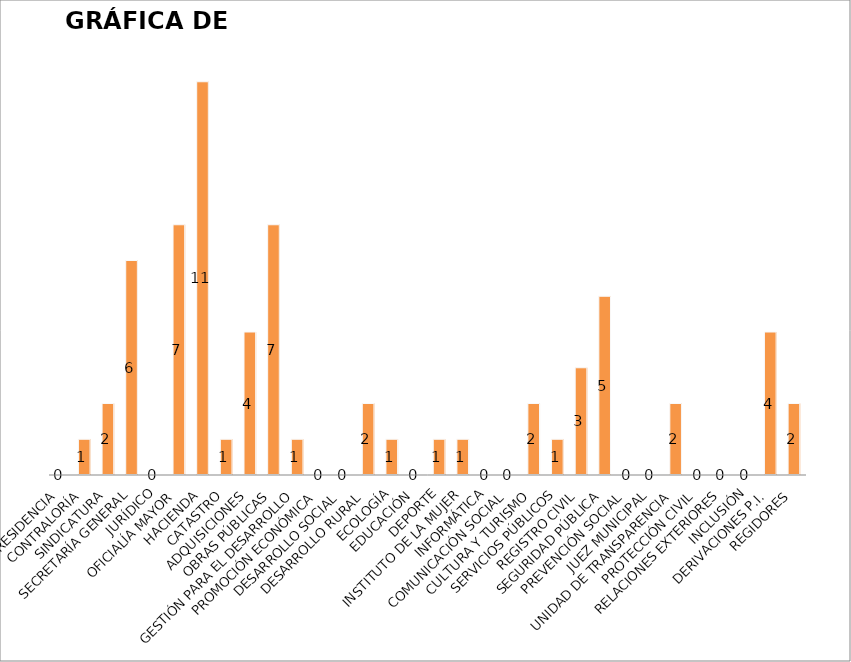
| Category | Series 0 |
|---|---|
| PRESIDENCIA | 0 |
| CONTRALORÍA | 1 |
| SINDICATURA | 2 |
| SECRETARÍA GENERAL | 6 |
| JURÍDICO | 0 |
| OFICIALÍA MAYOR | 7 |
| HACIENDA | 11 |
| CATASTRO | 1 |
| ADQUISICIONES | 4 |
| OBRAS PÚBLICAS | 7 |
| GESTIÓN PARA EL DESARROLLO | 1 |
| PROMOCIÓN ECONÓMICA | 0 |
| DESARROLLO SOCIAL | 0 |
| DESARROLLO RURAL | 2 |
| ECOLOGÍA | 1 |
| EDUCACIÓN | 0 |
| DEPORTE | 1 |
| INSTITUTO DE LA MUJER | 1 |
| INFORMÁTICA | 0 |
| COMUNICACIÓN SOCIAL | 0 |
| CULTURA Y TURISMO | 2 |
| SERVICIOS PÚBLICOS | 1 |
| REGISTRO CIVIL | 3 |
| SEGURIDAD PÚBLICA | 5 |
| PREVENCIÓN SOCIAL | 0 |
| JUEZ MUNICIPAL | 0 |
| UNIDAD DE TRANSPARENCIA | 2 |
| PROTECCIÓN CIVIL | 0 |
| RELACIONES EXTERIORES | 0 |
| INCLUSIÓN | 0 |
| DERIVACIONES P.I. | 4 |
| REGIDORES | 2 |